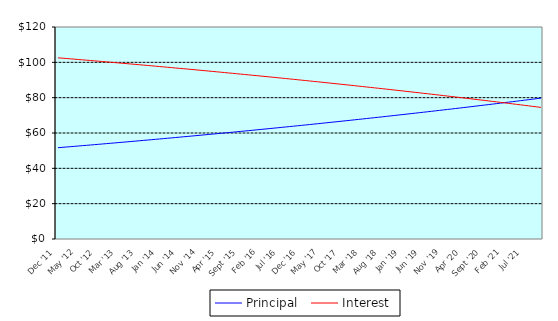
| Category | Principal | Interest |
|---|---|---|
| 0 | 51.69 | 102.55 |
| 1900-01-01 | 51.87 | 102.37 |
| 1900-01-02 | 52.06 | 102.18 |
| 1900-01-03 | 52.25 | 101.99 |
| 1900-01-04 | 52.44 | 101.8 |
| 1900-01-05 | 52.64 | 101.6 |
| 1900-01-06 | 52.83 | 101.41 |
| 1900-01-07 | 53.02 | 101.22 |
| 1900-01-08 | 53.21 | 101.03 |
| 1900-01-09 | 53.41 | 100.83 |
| 1900-01-10 | 53.6 | 100.64 |
| 1900-01-11 | 53.8 | 100.44 |
| 1900-01-12 | 54 | 100.24 |
| 1900-01-13 | 54.19 | 100.05 |
| 1900-01-14 | 54.39 | 99.85 |
| 1900-01-15 | 54.59 | 99.65 |
| 1900-01-16 | 54.79 | 99.45 |
| 1900-01-17 | 54.99 | 99.25 |
| 1900-01-18 | 55.19 | 99.05 |
| 1900-01-19 | 55.39 | 98.85 |
| 1900-01-20 | 55.59 | 98.65 |
| 1900-01-21 | 55.8 | 98.44 |
| 1900-01-22 | 56 | 98.24 |
| 1900-01-23 | 56.2 | 98.04 |
| 1900-01-24 | 56.41 | 97.83 |
| 1900-01-25 | 56.62 | 97.62 |
| 1900-01-26 | 56.82 | 97.42 |
| 1900-01-27 | 57.03 | 97.21 |
| 1900-01-28 | 57.24 | 97 |
| 1900-01-29 | 57.45 | 96.79 |
| 1900-01-30 | 57.66 | 96.58 |
| 1900-01-31 | 57.87 | 96.37 |
| 1900-02-01 | 58.08 | 96.16 |
| 1900-02-02 | 58.29 | 95.95 |
| 1900-02-03 | 58.5 | 95.74 |
| 1900-02-04 | 58.72 | 95.52 |
| 1900-02-05 | 58.93 | 95.31 |
| 1900-02-06 | 59.15 | 95.09 |
| 1900-02-07 | 59.36 | 94.88 |
| 1900-02-08 | 59.58 | 94.66 |
| 1900-02-09 | 59.8 | 94.44 |
| 1900-02-10 | 60.02 | 94.22 |
| 1900-02-11 | 60.23 | 94.01 |
| 1900-02-12 | 60.45 | 93.79 |
| 1900-02-13 | 60.68 | 93.56 |
| 1900-02-14 | 60.9 | 93.34 |
| 1900-02-15 | 61.12 | 93.12 |
| 1900-02-16 | 61.34 | 92.9 |
| 1900-02-17 | 61.57 | 92.67 |
| 1900-02-18 | 61.79 | 92.45 |
| 1900-02-19 | 62.02 | 92.22 |
| 1900-02-20 | 62.24 | 92 |
| 1900-02-21 | 62.47 | 91.77 |
| 1900-02-22 | 62.7 | 91.54 |
| 1900-02-23 | 62.93 | 91.31 |
| 1900-02-24 | 63.16 | 91.08 |
| 1900-02-25 | 63.39 | 90.85 |
| 1900-02-26 | 63.62 | 90.62 |
| 1900-02-27 | 63.85 | 90.39 |
| 1900-02-28 | 64.08 | 90.16 |
| 1900-02-28 | 64.32 | 89.92 |
| 1900-03-01 | 64.55 | 89.69 |
| 1900-03-02 | 64.79 | 89.45 |
| 1900-03-03 | 65.03 | 89.21 |
| 1900-03-04 | 65.26 | 88.98 |
| 1900-03-05 | 65.5 | 88.74 |
| 1900-03-06 | 65.74 | 88.5 |
| 1900-03-07 | 65.98 | 88.26 |
| 1900-03-08 | 66.22 | 88.02 |
| 1900-03-09 | 66.46 | 87.78 |
| 1900-03-10 | 66.71 | 87.53 |
| 1900-03-11 | 66.95 | 87.29 |
| 1900-03-12 | 67.19 | 87.05 |
| 1900-03-13 | 67.44 | 86.8 |
| 1900-03-14 | 67.69 | 86.55 |
| 1900-03-15 | 67.93 | 86.31 |
| 1900-03-16 | 68.18 | 86.06 |
| 1900-03-17 | 68.43 | 85.81 |
| 1900-03-18 | 68.68 | 85.56 |
| 1900-03-19 | 68.93 | 85.31 |
| 1900-03-20 | 69.18 | 85.06 |
| 1900-03-21 | 69.43 | 84.81 |
| 1900-03-22 | 69.69 | 84.55 |
| 1900-03-23 | 69.94 | 84.3 |
| 1900-03-24 | 70.2 | 84.04 |
| 1900-03-25 | 70.45 | 83.79 |
| 1900-03-26 | 70.71 | 83.53 |
| 1900-03-27 | 70.97 | 83.27 |
| 1900-03-28 | 71.23 | 83.01 |
| 1900-03-29 | 71.49 | 82.75 |
| 1900-03-30 | 71.75 | 82.49 |
| 1900-03-31 | 72.01 | 82.23 |
| 1900-04-01 | 72.27 | 81.97 |
| 1900-04-02 | 72.54 | 81.7 |
| 1900-04-03 | 72.8 | 81.44 |
| 1900-04-04 | 73.07 | 81.17 |
| 1900-04-05 | 73.34 | 80.9 |
| 1900-04-06 | 73.6 | 80.64 |
| 1900-04-07 | 73.87 | 80.37 |
| 1900-04-08 | 74.14 | 80.1 |
| 1900-04-09 | 74.41 | 79.83 |
| 1900-04-10 | 74.68 | 79.56 |
| 1900-04-11 | 74.96 | 79.28 |
| 1900-04-12 | 75.23 | 79.01 |
| 1900-04-13 | 75.51 | 78.73 |
| 1900-04-14 | 75.78 | 78.46 |
| 1900-04-15 | 76.06 | 78.18 |
| 1900-04-16 | 76.34 | 77.9 |
| 1900-04-17 | 76.61 | 77.63 |
| 1900-04-18 | 76.89 | 77.35 |
| 1900-04-19 | 77.17 | 77.07 |
| 1900-04-20 | 77.46 | 76.78 |
| 1900-04-21 | 77.74 | 76.5 |
| 1900-04-22 | 78.02 | 76.22 |
| 1900-04-23 | 78.31 | 75.93 |
| 1900-04-24 | 78.59 | 75.65 |
| 1900-04-25 | 78.88 | 75.36 |
| 1900-04-26 | 79.17 | 75.07 |
| 1900-04-27 | 79.46 | 74.78 |
| 1900-04-28 | 79.75 | 74.49 |